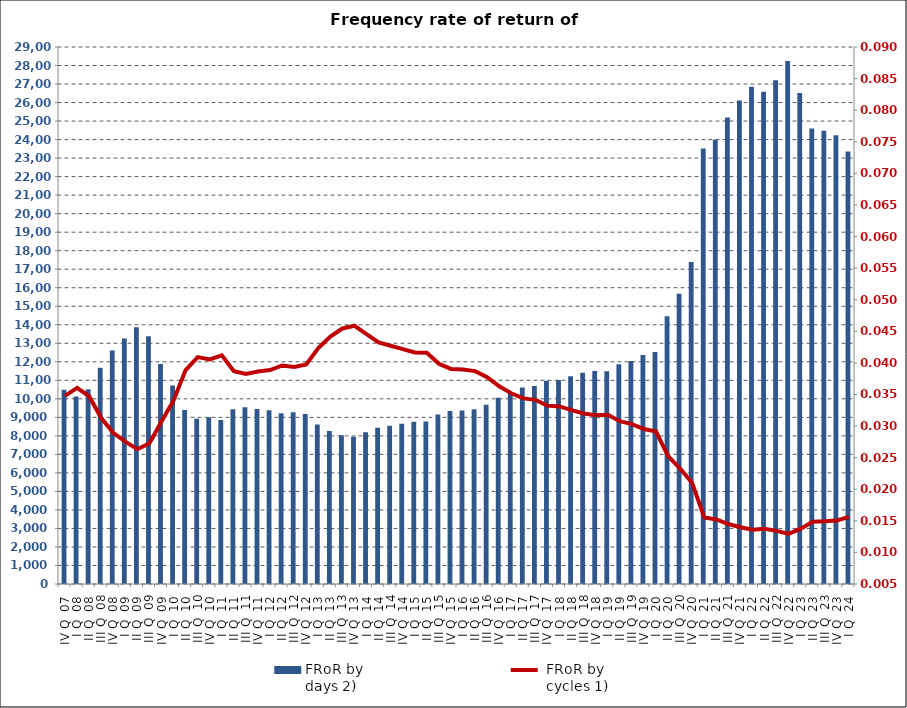
| Category | FRoR by 
days 2) |
|---|---|
| IV Q  07 | 10491.876 |
| I Q  08 | 10127.197 |
| II Q  08 | 10512.864 |
| III Q  08 | 11671.936 |
| IV Q  08 | 12611.836 |
| I Q  09 | 13260.408 |
| II Q  09 | 13868.06 |
| III Q  09 | 13381.347 |
| IV Q  09 | 11883.56 |
| I Q  10 | 10717.946 |
| II Q  10 | 9390.312 |
| III Q  10 | 8920.023 |
| IV Q  10 | 8999.68 |
| I Q  11 | 8860.681 |
| II Q  11 | 9434.733 |
| III Q  11 | 9545.864 |
| IV Q  11 | 9449.084 |
| I Q  12 | 9389.736 |
| II Q  12 | 9217.635 |
| III Q  12 | 9273.259 |
| IV Q  12 | 9185.587 |
| I Q  13 | 8618.667 |
| II Q  13 | 8265.801 |
| III Q  13 | 8031.674 |
| IV Q  13 | 7955.696 |
| I Q  14 | 8189.844 |
| II Q  14 | 8444.051 |
| III Q  14 | 8546.063 |
| IV Q  14 | 8652.607 |
| I Q  15 | 8766.39 |
| II Q  15 | 8775.541 |
| III Q  15 | 9157.205 |
| IV Q  15 | 9349.249 |
| I Q  16 | 9371.049 |
| II Q  16 | 9432.745 |
| III Q  16 | 9675.077 |
| IV Q  16 | 10056.096 |
| I Q  17 | 10373.433 |
| II Q  17 | 10616.203 |
| III Q  17 | 10690.234 |
| IV Q  17 | 10982.963 |
| I Q  18 | 11022.304 |
| II Q  18 | 11224.636 |
| III Q  18 | 11411.384 |
| IV Q  18 | 11504.028 |
| I Q  19 | 11487.295 |
| II Q  19 | 11862.846 |
| III Q  19 | 12041.92 |
| IV Q  19 | 12360.982 |
| I Q  20 | 12528.203 |
| II Q  20 | 14464.543 |
| III Q  20 | 15677.85 |
| IV Q  20 | 17385.621 |
| I Q  21 | 23513.238 |
| II Q  21 | 23996.829 |
| III Q  21 | 25190.242 |
| IV Q  21 | 26107.278 |
| I Q  22 | 26856.907 |
| II Q  22 | 26585.017 |
| III Q  22 | 27209.406 |
| IV Q  22 | 28243.903 |
| I Q  23 | 26515.923 |
| II Q  23 | 24600.326 |
| III Q  23 | 24472.74 |
| IV Q  23 | 24227.688 |
| I Q  24 | 23358.064 |